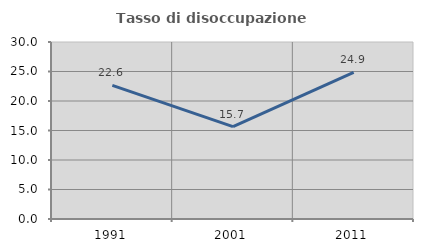
| Category | Tasso di disoccupazione giovanile  |
|---|---|
| 1991.0 | 22.643 |
| 2001.0 | 15.666 |
| 2011.0 | 24.864 |